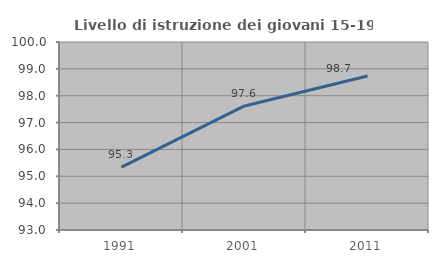
| Category | Livello di istruzione dei giovani 15-19 anni |
|---|---|
| 1991.0 | 95.339 |
| 2001.0 | 97.619 |
| 2011.0 | 98.734 |